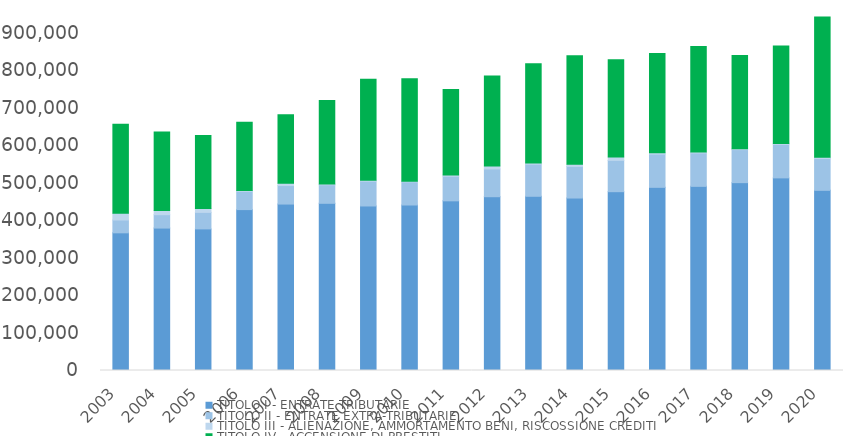
| Category | TITOLO I - ENTRATE TRIBUTARIE | TITOLO II - ENTRATE EXTRA-TRIBUTARIE | TITOLO III - ALIENAZIONE, AMMORTAMENTO BENI, RISCOSSIONE CREDITI | TITOLO IV - ACCENSIONE DI PRESTITI |
|---|---|---|---|---|
| 2003.0 | 367408 | 34150 | 17949 | 237530 |
| 2004.0 | 380062 | 35715 | 10992 | 209685 |
| 2005.0 | 377854 | 44105 | 10075 | 195380 |
| 2006.0 | 429363 | 48759 | 1921 | 182127 |
| 2007.0 | 444168 | 49382 | 6121 | 182747 |
| 2008.0 | 446165 | 49400 | 2182 | 222489 |
| 2009.0 | 439017 | 66150 | 2630 | 269718 |
| 2010.0 | 441614 | 61791 | 1921 | 272921 |
| 2011.0 | 452731.044 | 65697.905 | 3313.451 | 228422.129 |
| 2012.0 | 463768.62 | 74075.721 | 7946.719 | 239783.649 |
| 2013.0 | 464884.401 | 85665.455 | 3441.99 | 264846.999 |
| 2014.0 | 460253.424 | 84387.467 | 5545.741 | 289972.991 |
| 2015.0 | 477177.749 | 83602.841 | 8785.048 | 259542.417 |
| 2016.0 | 488794.687 | 88691.962 | 3828.358 | 264618.209 |
| 2017.0 | 491417.598 | 89081.525 | 2475.107 | 281609.658 |
| 2018.0 | 501300.352 | 88110.76 | 2200.483 | 249065.559 |
| 2019.0 | 513989.749 | 89462.788 | 2131.594 | 260408.77 |
| 2020.0 | 480774.445 | 84672.569 | 3760.895 | 374284.433 |